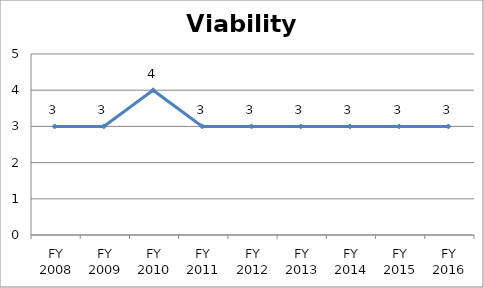
| Category | Viability score |
|---|---|
| FY 2016 | 3 |
| FY 2015 | 3 |
| FY 2014 | 3 |
| FY 2013 | 3 |
| FY 2012 | 3 |
| FY 2011 | 3 |
| FY 2010 | 4 |
| FY 2009 | 3 |
| FY 2008 | 3 |